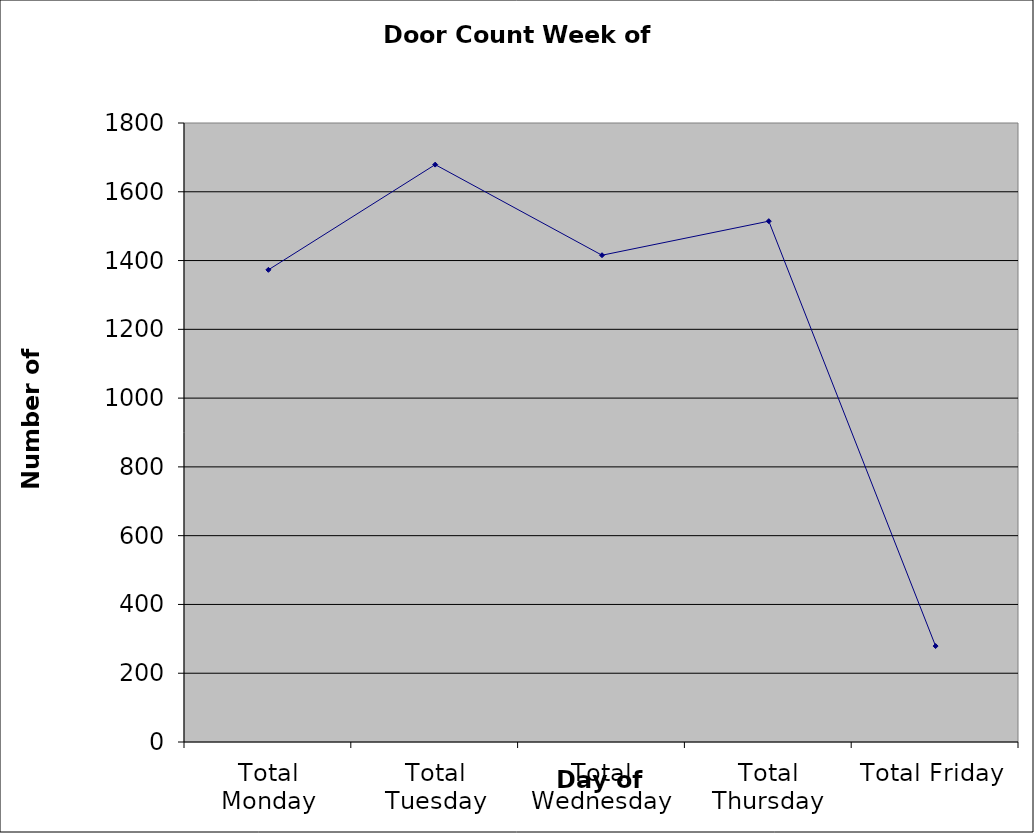
| Category | Series 0 |
|---|---|
| Total Monday | 1373 |
| Total Tuesday | 1679 |
| Total Wednesday | 1415.5 |
| Total Thursday | 1514.5 |
| Total Friday | 279 |